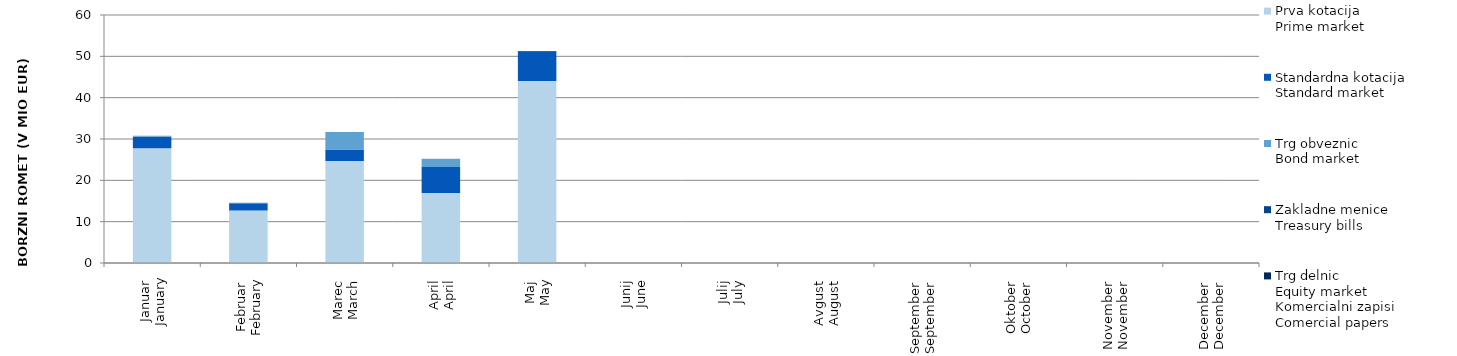
| Category | Prva kotacija
Prime market | Standardna kotacija
Standard market | Trg obveznic
Bond market | Zakladne menice
Treasury bills | Trg delnic
Equity market |
|---|---|---|---|---|---|
| Januar
January | 27.745 | 2.796 | 0.249 | 0 | 0 |
| Februar
February | 12.685 | 1.784 | 0.118 | 0 | 0 |
| Marec
March | 24.676 | 2.813 | 4.174 | 0 | 0 |
| April
April | 16.942 | 6.272 | 2.01 | 0 | 0 |
| Maj
May | 44.02 | 7.1 | 0 | 0.145 | 0 |
| Junij
June | 0 | 0 | 0 | 0 | 0 |
| Julij
July | 0 | 0 | 0 | 0 | 0 |
| Avgust
August | 0 | 0 | 0 | 0 | 0 |
| September
September | 0 | 0 | 0 | 0 | 0 |
| Oktober
October | 0 | 0 | 0 | 0 | 0 |
| November
November | 0 | 0 | 0 | 0 | 0 |
| December
December | 0 | 0 | 0 | 0 | 0 |